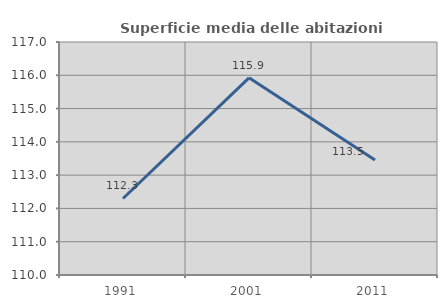
| Category | Superficie media delle abitazioni occupate |
|---|---|
| 1991.0 | 112.299 |
| 2001.0 | 115.923 |
| 2011.0 | 113.455 |